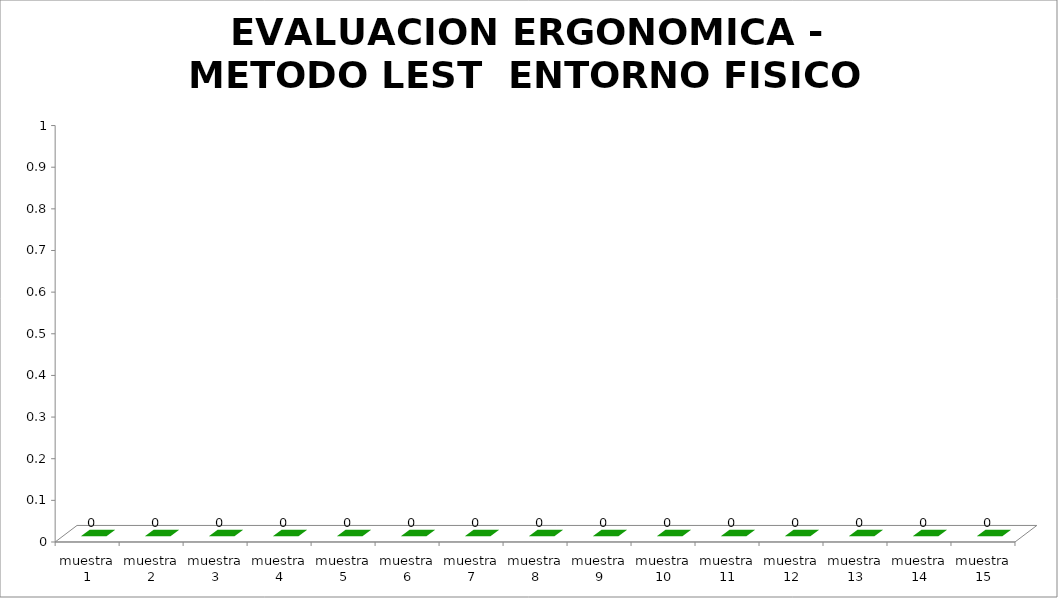
| Category | EVALUACION ERGONOMICA - METODO LEST  |
|---|---|
| muestra 1 | 0 |
| muestra 2 | 0 |
| muestra 3 | 0 |
| muestra 4 | 0 |
| muestra 5 | 0 |
| muestra 6 | 0 |
| muestra 7 | 0 |
| muestra 8 | 0 |
| muestra 9 | 0 |
| muestra 10 | 0 |
| muestra 11 | 0 |
| muestra 12 | 0 |
| muestra 13 | 0 |
| muestra 14 | 0 |
| muestra 15 | 0 |